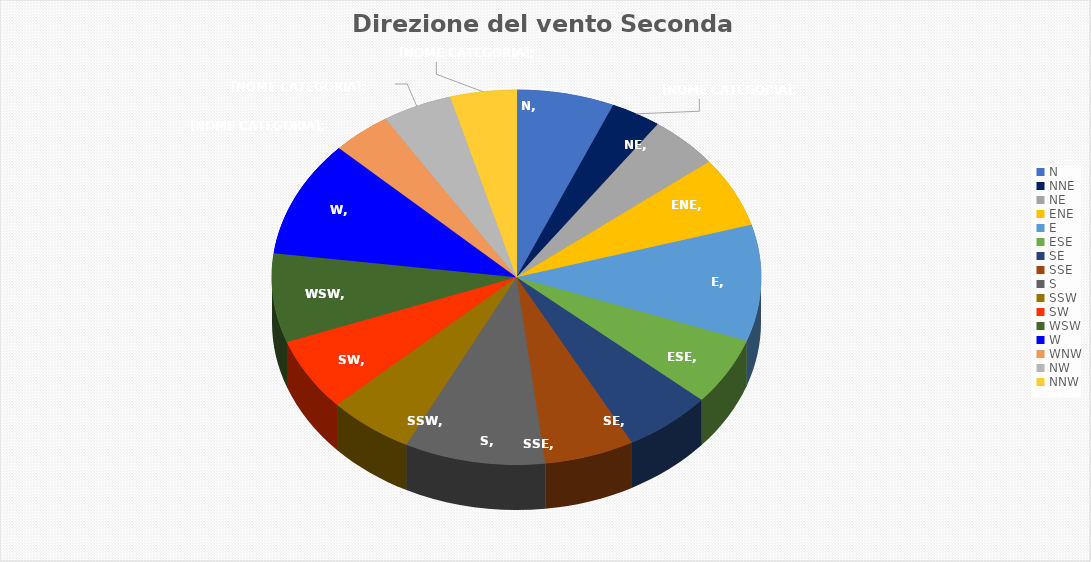
| Category | Percentuale |
|---|---|
| N | 6.458 |
| NNE | 3.333 |
| NE | 4.618 |
| ENE | 6.076 |
| E | 10.035 |
| ESE | 5.833 |
| SE | 5.833 |
| SSE | 5.938 |
| S | 9.306 |
| SSW | 5.66 |
| SW | 6.285 |
| WSW | 7.674 |
| W | 10.035 |
| WNW | 3.924 |
| NW | 4.618 |
| NNW | 4.375 |